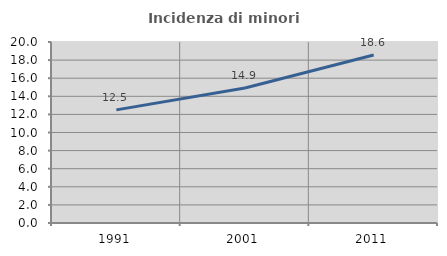
| Category | Incidenza di minori stranieri |
|---|---|
| 1991.0 | 12.5 |
| 2001.0 | 14.925 |
| 2011.0 | 18.557 |